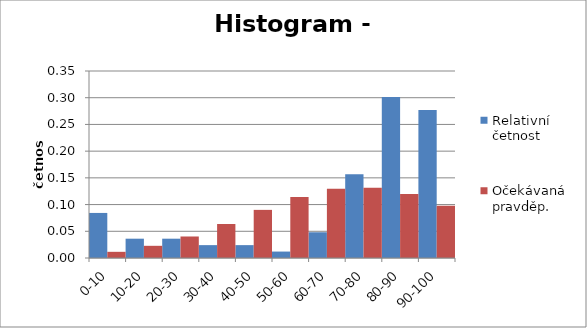
| Category | Relativní četnost | Očekávaná pravděp. |
|---|---|---|
| 0-10 | 0.084 | 0.012 |
| 10-20 | 0.036 | 0.023 |
| 20-30 | 0.036 | 0.04 |
| 30-40 | 0.024 | 0.064 |
| 40-50 | 0.024 | 0.09 |
| 50-60 | 0.012 | 0.114 |
| 60-70 | 0.048 | 0.13 |
| 70-80 | 0.157 | 0.132 |
| 80-90 | 0.301 | 0.12 |
| 90-100 | 0.277 | 0.098 |